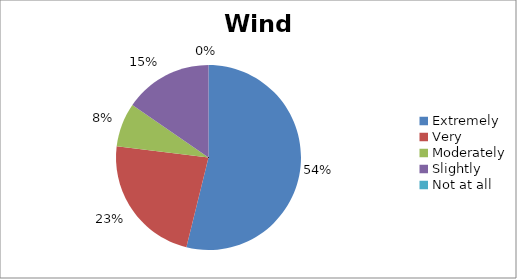
| Category | Wind |
|---|---|
| Extremely | 7 |
| Very | 3 |
| Moderately | 1 |
| Slightly | 2 |
| Not at all | 0 |